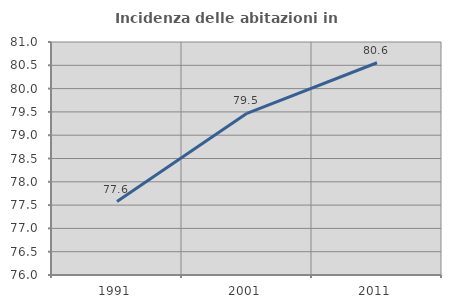
| Category | Incidenza delle abitazioni in proprietà  |
|---|---|
| 1991.0 | 77.577 |
| 2001.0 | 79.47 |
| 2011.0 | 80.554 |